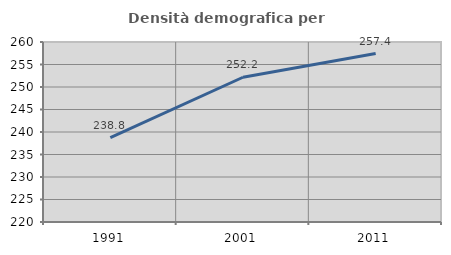
| Category | Densità demografica |
|---|---|
| 1991.0 | 238.752 |
| 2001.0 | 252.165 |
| 2011.0 | 257.435 |